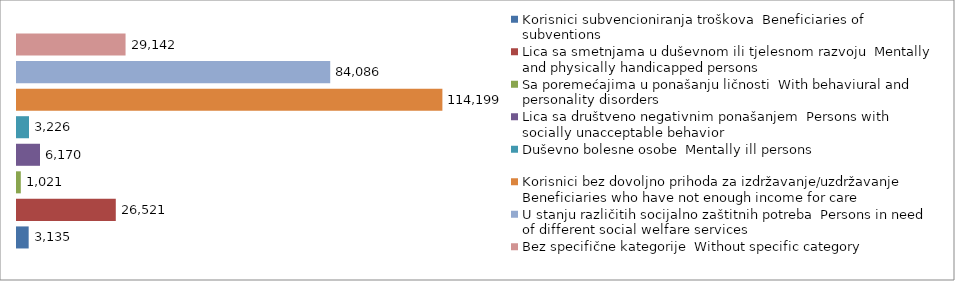
| Category | Korisnici subvencioniranja troškova  Beneficiaries of subventions | Lica sa smetnjama u duševnom ili tjelesnom razvoju  Mentally and physically handicapped persons | Sa poremećajima u ponašanju ličnosti  With behaviural and personality disorders | Lica sa društveno negativnim ponašanjem  Persons with socially unacceptable behavior | Duševno bolesne osobe  Mentally ill persons | Korisnici bez dovoljno prihoda za izdržavanje/uzdržavanje  Beneficiaries who have not enough income for care | U stanju različitih socijalno zaštitnih potreba  Persons in need of different social welfare services | Bez specifične kategorije  Without specific category |
|---|---|---|---|---|---|---|---|---|
| 0 | 3135 | 26521 | 1021 | 6170 | 3226 | 114199 | 84086 | 29142 |